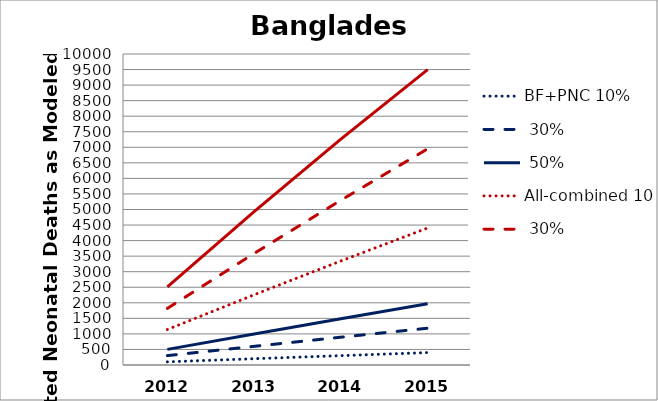
| Category | BF+PNC 10% | BF+PNC 30% | BF+PNC 50% | All-combined 10% | All-combined 30% | All-combined 50% |
|---|---|---|---|---|---|---|
| 2012.0 | 102 | 302 | 502 | 1141 | 1820 | 2512 |
| 2013.0 | 202 | 600 | 999 | 2258 | 3587 | 4934 |
| 2014.0 | 301 | 894 | 1487 | 3346 | 5298 | 7262 |
| 2015.0 | 399 | 1183 | 1968 | 4405 | 6951 | 9496 |